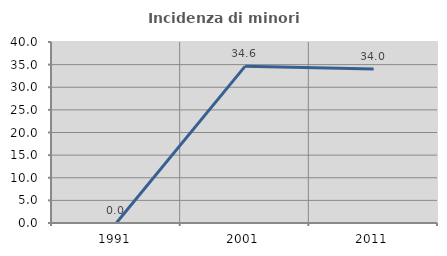
| Category | Incidenza di minori stranieri |
|---|---|
| 1991.0 | 0 |
| 2001.0 | 34.615 |
| 2011.0 | 34.043 |